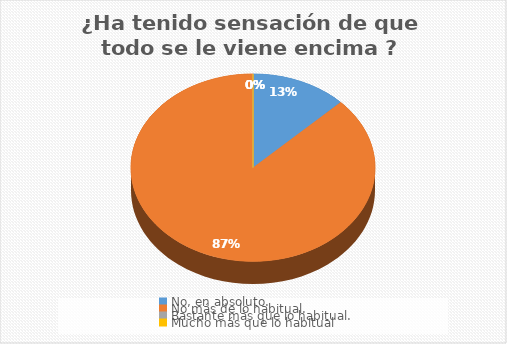
| Category | ¿ Ha tenido sensación de que todo se le viene encima ? |
|---|---|
| No, en absoluto. | 14 |
| No más de lo habitual. | 96 |
| Bastante más que lo habitual. | 0 |
| Mucho más que lo habitual | 0 |